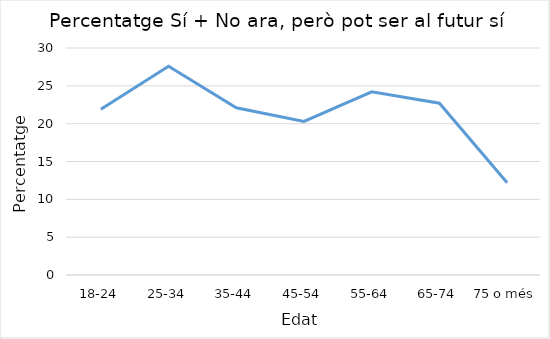
| Category | Series 0 |
|---|---|
| 18-24 | 21.9 |
| 25-34 | 27.6 |
| 35-44 | 22.1 |
| 45-54 | 20.3 |
| 55-64 | 24.2 |
| 65-74 | 22.7 |
| 75 o més | 12.2 |